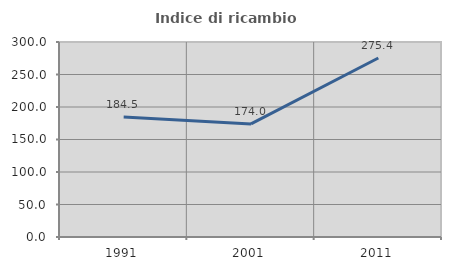
| Category | Indice di ricambio occupazionale  |
|---|---|
| 1991.0 | 184.483 |
| 2001.0 | 173.973 |
| 2011.0 | 275.362 |